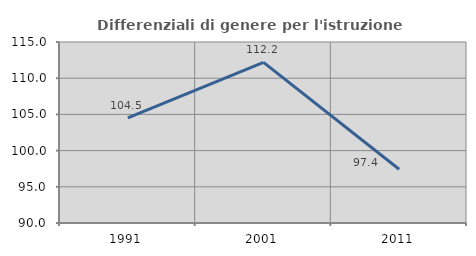
| Category | Differenziali di genere per l'istruzione superiore |
|---|---|
| 1991.0 | 104.506 |
| 2001.0 | 112.176 |
| 2011.0 | 97.422 |